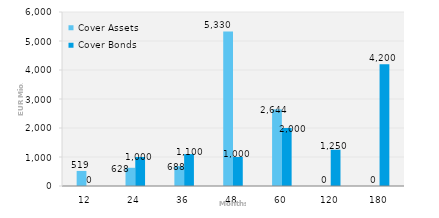
| Category | Cover Assets | Cover Bonds |
|---|---|---|
| 12.0 | 519.454 | 0 |
| 24.0 | 628.015 | 1000 |
| 36.0 | 687.896 | 1100 |
| 48.0 | 5330.468 | 1000 |
| 60.0 | 2644.018 | 2000 |
| 120.0 | 0 | 1250 |
| 180.0 | 0 | 4200 |